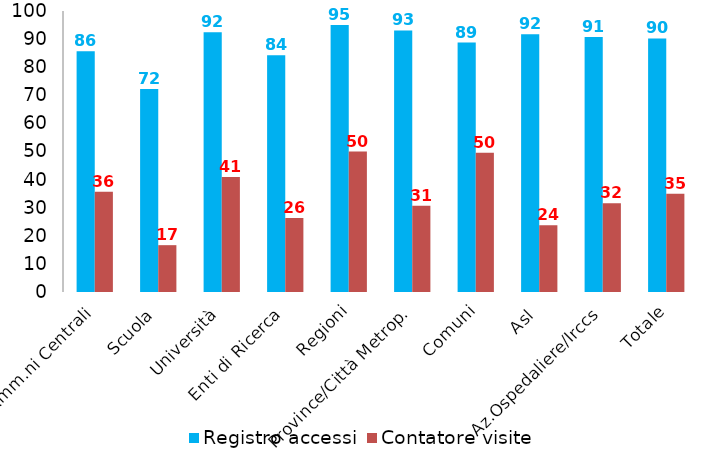
| Category | Registro accessi | Contatore visite |
|---|---|---|
| Amm.ni Centrali | 85.714 | 35.714 |
| Scuola | 72.222 | 16.667 |
| Università | 92.424 | 40.909 |
| Enti di Ricerca | 84.211 | 26.316 |
| Regioni | 95 | 50 |
| Province/Città Metrop. | 93.069 | 30.693 |
| Comuni | 88.785 | 49.533 |
| Asl | 91.753 | 23.711 |
| Az.Ospedaliere/Irccs | 90.789 | 31.579 |
| Totale | 90.226 | 34.962 |